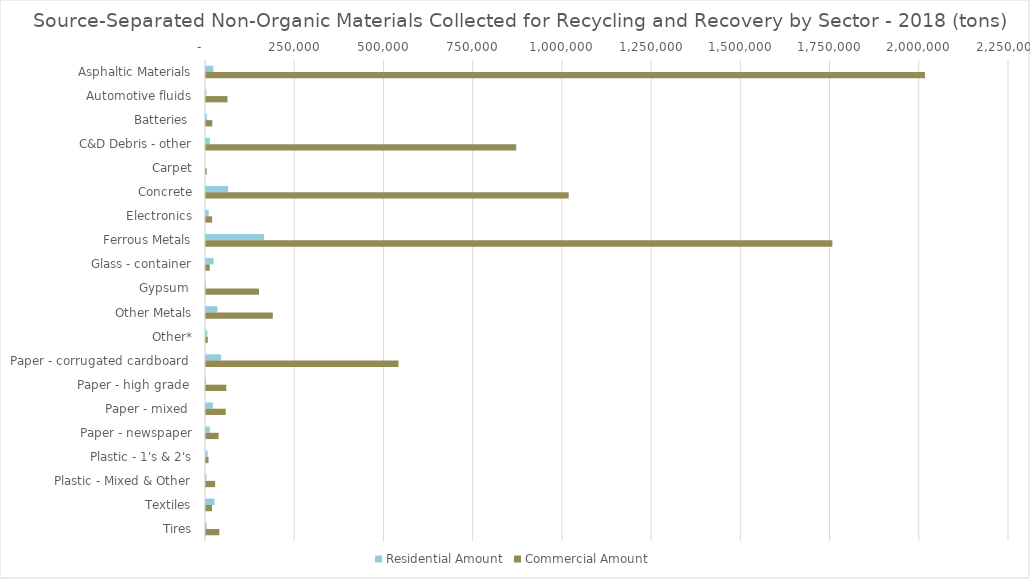
| Category | Residential Amount | Commercial Amount |
|---|---|---|
| Asphaltic Materials | 20634.12 | 2014452.82 |
| Automotive fluids | 1105.29 | 60199.79 |
| Batteries  | 2936.71 | 17485.77 |
| C&D Debris - other | 10902.5 | 869293.33 |
| Carpet | 0 | 2132.21 |
| Concrete | 61923.62 | 1016143.51 |
| Electronics | 7532.09 | 17209.57 |
| Ferrous Metals | 162427.41 | 1755110.66 |
| Glass - container | 21459.84 | 10447.26 |
| Gypsum  | 94 | 148632.29 |
| Other Metals | 32014.87 | 187237.14 |
| Other* | 3558.95 | 4912.91 |
| Paper - corrugated cardboard  | 42469.4 | 539334.9 |
| Paper - high grade  | 499.46 | 56875.82 |
| Paper - mixed  | 19302.47 | 55276.17 |
| Paper - newspaper | 10374.6 | 35290.3 |
| Plastic - 1's & 2's | 4540.97 | 7089.08 |
| Plastic - Mixed & Other | 1404.05 | 25625.52 |
| Textiles | 23735.65 | 16791.43 |
| Tires | 2207.24 | 37397.81 |